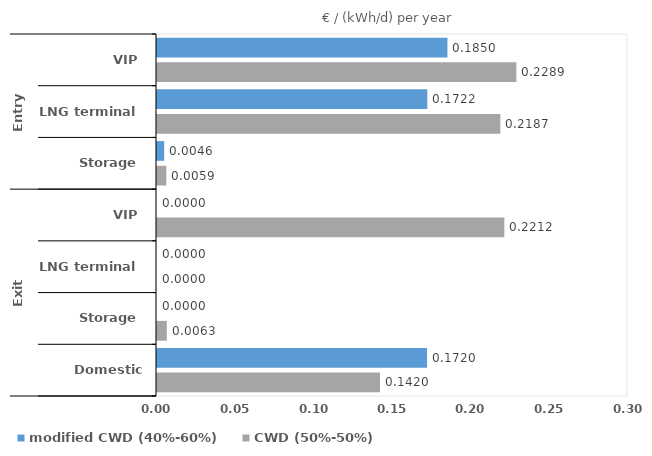
| Category | modified CWD (40%-60%) | CWD (50%-50%) |
|---|---|---|
| 0 | 0.185 | 0.229 |
| 1 | 0.172 | 0.219 |
| 2 | 0.005 | 0.006 |
| 3 | 0 | 0.221 |
| 4 | 0 | 0 |
| 5 | 0 | 0.006 |
| 6 | 0.172 | 0.142 |